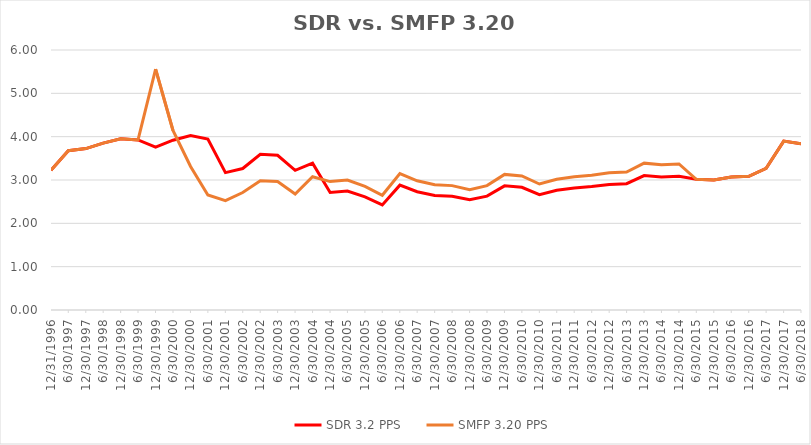
| Category | SDR 3.2 PPS | SMFP 3.20 PPS |
|---|---|---|
| 12/31/96 | 3.225 | 3.225 |
| 6/30/97 | 3.675 | 3.675 |
| 12/31/97 | 3.725 | 3.725 |
| 6/30/98 | 3.85 | 3.85 |
| 12/31/98 | 3.95 | 3.95 |
| 6/30/99 | 3.925 | 3.925 |
| 12/31/99 | 3.757 | 5.56 |
| 6/30/00 | 3.919 | 4.143 |
| 12/31/00 | 4.027 | 3.311 |
| 6/30/01 | 3.946 | 2.655 |
| 12/31/01 | 3.17 | 2.525 |
| 6/30/02 | 3.265 | 2.712 |
| 12/31/02 | 3.592 | 2.983 |
| 6/30/03 | 3.571 | 2.966 |
| 12/31/03 | 3.224 | 2.678 |
| 6/30/04 | 3.388 | 3.074 |
| 12/31/04 | 2.712 | 2.963 |
| 6/30/05 | 2.746 | 3 |
| 12/31/05 | 2.61 | 2.852 |
| 6/30/06 | 2.424 | 2.648 |
| 12/31/06 | 2.881 | 3.148 |
| 6/30/07 | 2.729 | 2.981 |
| 12/31/07 | 2.644 | 2.889 |
| 6/30/08 | 2.627 | 2.87 |
| 12/31/08 | 2.542 | 2.778 |
| 6/30/09 | 2.627 | 2.87 |
| 12/31/09 | 2.864 | 3.13 |
| 6/30/10 | 2.831 | 3.093 |
| 12/31/10 | 2.661 | 2.907 |
| 6/30/11 | 2.763 | 3.019 |
| 12/31/11 | 2.814 | 3.074 |
| 6/30/12 | 2.847 | 3.111 |
| 12/31/12 | 2.898 | 3.167 |
| 6/30/13 | 2.915 | 3.185 |
| 12/31/13 | 3.102 | 3.389 |
| 6/30/14 | 3.068 | 3.352 |
| 12/31/14 | 3.085 | 3.37 |
| 6/30/15 | 3.017 | 3.017 |
| 12/31/15 | 3 | 3 |
| 6/30/16 | 3.068 | 3.068 |
| 12/31/16 | 3.085 | 3.085 |
| 6/30/17 | 3.271 | 3.271 |
| 12/31/17 | 3.898 | 3.898 |
| 6/30/18 | 3.837 | 3.837 |